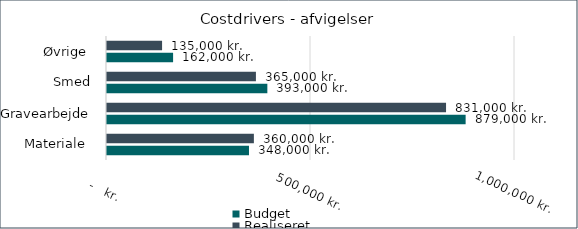
| Category | Budget | Realiseret |
|---|---|---|
| Materiale  | 348000 | 360000 |
| Gravearbejde | 879000 | 831000 |
| Smed | 393000 | 365000 |
| Øvrige  | 162000 | 135000 |